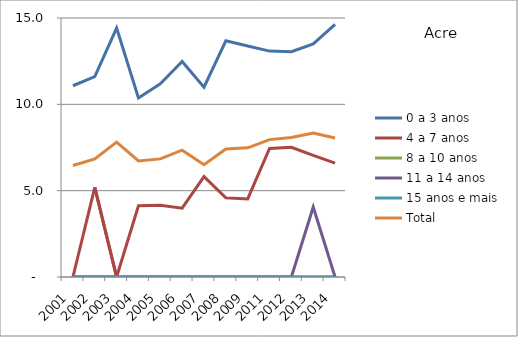
| Category | 0 a 3 anos | 4 a 7 anos | 8 a 10 anos | 11 a 14 anos | 15 anos e mais | Total |
|---|---|---|---|---|---|---|
| 2001.0 | 11.076 | 0 | 0 | 0 | 0 | 6.457 |
| 2002.0 | 11.606 | 5.191 | 0 | 0 | 0 | 6.835 |
| 2003.0 | 14.416 | 0 | 0 | 0 | 0 | 7.813 |
| 2004.0 | 10.373 | 4.122 | 0 | 0 | 0 | 6.719 |
| 2005.0 | 11.193 | 4.155 | 0 | 0 | 0 | 6.84 |
| 2006.0 | 12.477 | 3.987 | 0 | 0 | 0 | 7.347 |
| 2007.0 | 10.99 | 5.811 | 0 | 0 | 0 | 6.507 |
| 2008.0 | 13.679 | 4.586 | 0 | 0 | 0 | 7.416 |
| 2009.0 | 13.375 | 4.523 | 0 | 0 | 0 | 7.48 |
| 2011.0 | 13.084 | 7.444 | 0 | 0 | 0 | 7.956 |
| 2012.0 | 13.049 | 7.515 | 0 | 0 | 0 | 8.084 |
| 2013.0 | 13.499 | 7.044 | 0 | 4.054 | 0 | 8.332 |
| 2014.0 | 14.632 | 6.597 | 0 | 0 | 0 | 8.051 |